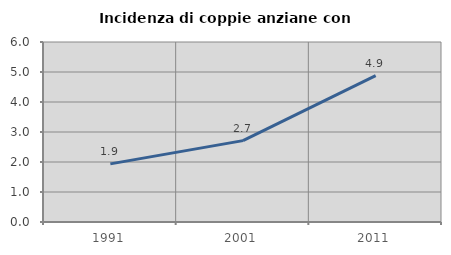
| Category | Incidenza di coppie anziane con figli |
|---|---|
| 1991.0 | 1.937 |
| 2001.0 | 2.712 |
| 2011.0 | 4.882 |